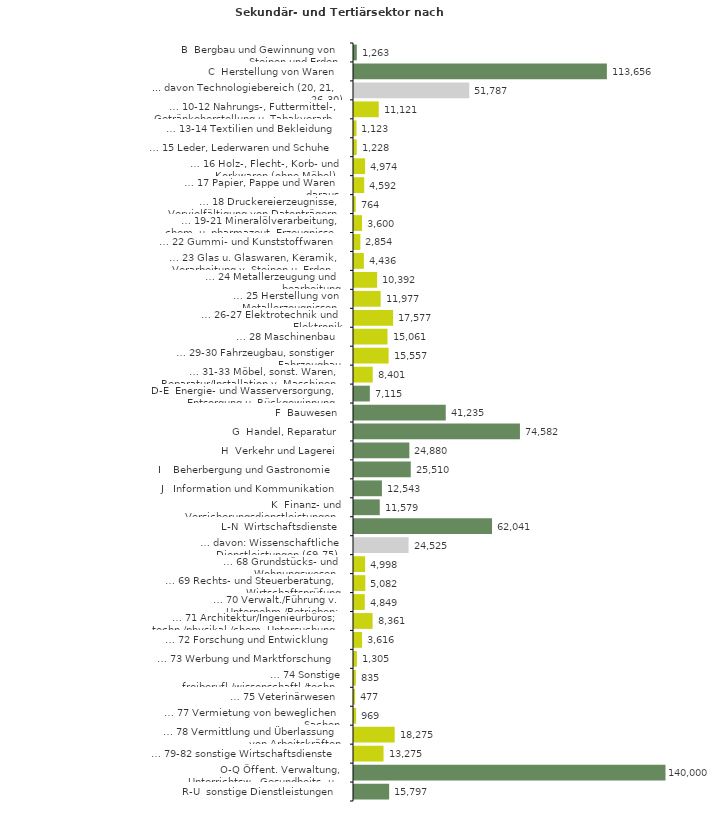
| Category | Series 0 |
|---|---|
| B  Bergbau und Gewinnung von Steinen und Erden | 1263 |
| C  Herstellung von Waren | 113656 |
| ... davon Technologiebereich (20, 21, 26-30) | 51787 |
| … 10-12 Nahrungs-, Futtermittel-, Getränkeherstellung u. Tabakverarb. | 11121 |
| … 13-14 Textilien und Bekleidung | 1123 |
| … 15 Leder, Lederwaren und Schuhe | 1228 |
| … 16 Holz-, Flecht-, Korb- und Korkwaren (ohne Möbel)  | 4974 |
| … 17 Papier, Pappe und Waren daraus  | 4592 |
| … 18 Druckereierzeugnisse, Vervielfältigung von Datenträgern | 764 |
| … 19-21 Mineralölverarbeitung, chem. u. pharmazeut. Erzeugnisse | 3600 |
| … 22 Gummi- und Kunststoffwaren | 2854 |
| … 23 Glas u. Glaswaren, Keramik, Verarbeitung v. Steinen u. Erden  | 4436 |
| … 24 Metallerzeugung und -bearbeitung | 10392 |
| … 25 Herstellung von Metallerzeugnissen  | 11977 |
| … 26-27 Elektrotechnik und Elektronik | 17577 |
| … 28 Maschinenbau | 15061 |
| … 29-30 Fahrzeugbau, sonstiger Fahrzeugbau | 15557 |
| … 31-33 Möbel, sonst. Waren, Reparatur/Installation v. Maschinen | 8401 |
| D-E  Energie- und Wasserversorgung, Entsorgung u. Rückgewinnung | 7115 |
| F  Bauwesen | 41235 |
| G  Handel, Reparatur | 74582 |
| H  Verkehr und Lagerei | 24880 |
| I    Beherbergung und Gastronomie | 25510 |
| J   Information und Kommunikation | 12543 |
| K  Finanz- und Versicherungsdienstleistungen | 11579 |
| L-N  Wirtschaftsdienste | 62041 |
| … davon: Wissenschaftliche Dienstleistungen (69-75) | 24525 |
| … 68 Grundstücks- und Wohnungswesen  | 4998 |
| … 69 Rechts- und Steuerberatung, Wirtschaftsprüfung | 5082 |
| … 70 Verwalt./Führung v. Unternehm./Betrieben; Unternehmensberat. | 4849 |
| … 71 Architektur/Ingenieurbüros; techn./physikal./chem. Untersuchung | 8361 |
| … 72 Forschung und Entwicklung  | 3616 |
| … 73 Werbung und Marktforschung | 1305 |
| … 74 Sonstige freiberufl./wissenschaftl./techn. Tätigkeiten | 835 |
| … 75 Veterinärwesen | 477 |
| … 77 Vermietung von beweglichen Sachen  | 969 |
| … 78 Vermittlung und Überlassung von Arbeitskräften | 18275 |
| … 79-82 sonstige Wirtschaftsdienste | 13275 |
| O-Q Öffent. Verwaltung, Unterrichtsw., Gesundheits- u. Sozialwesen | 140000 |
| R-U  sonstige Dienstleistungen | 15797 |